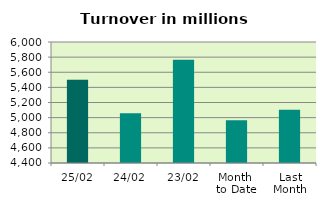
| Category | Series 0 |
|---|---|
| 25/02 | 5502.352 |
| 24/02 | 5058.807 |
| 23/02 | 5766.191 |
| Month 
to Date | 4966.318 |
| Last
Month | 5105.691 |